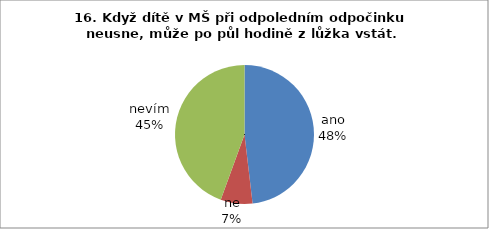
| Category | 16. |
|---|---|
| ano | 26 |
| ne | 4 |
| nevím | 24 |